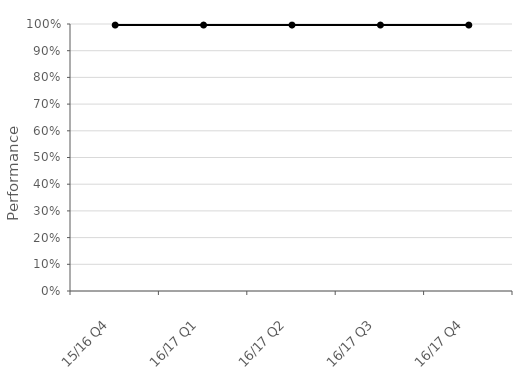
| Category | National |
|---|---|
| 15/16 Q4 | 0.996 |
| 16/17 Q1 | 0.996 |
| 16/17 Q2 | 0.996 |
| 16/17 Q3 | 0.996 |
| 16/17 Q4 | 0.996 |